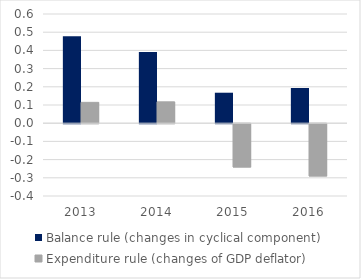
| Category | Balance rule (changes in cyclical component) | Expenditure rule (changes of GDP deflator) |
|---|---|---|
| 2013.0 | 0.477 | 0.115 |
| 2014.0 | 0.391 | 0.117 |
| 2015.0 | 0.167 | -0.238 |
| 2016.0 | 0.193 | -0.287 |